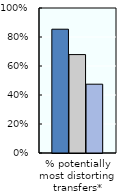
| Category | 1986-88 | 2000-02 | 2018-20 |
|---|---|---|---|
| % potentially most distorting transfers* | 0.854 | 0.679 | 0.474 |